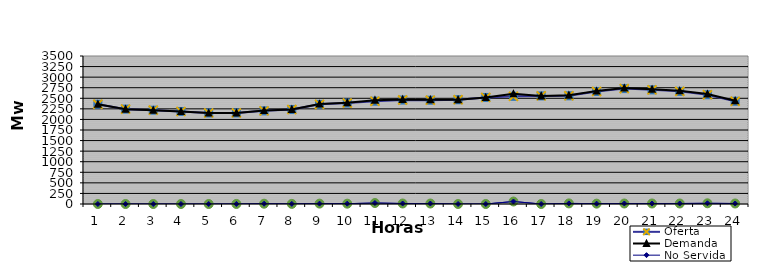
| Category | Oferta | No Servida | Demanda |
|---|---|---|---|
| 1.0 | 2359.7 | 0 | 2359.7 |
| 2.0 | 2243.56 | 0 | 2243.56 |
| 3.0 | 2218.55 | 0 | 2218.55 |
| 4.0 | 2187.33 | 0 | 2187.33 |
| 5.0 | 2151.81 | 0 | 2151.81 |
| 6.0 | 2153.67 | 1.23 | 2154.9 |
| 7.0 | 2202.43 | 6.9 | 2209.33 |
| 8.0 | 2234 | 2.69 | 2236.69 |
| 9.0 | 2356.62 | 9.014 | 2365.634 |
| 10.0 | 2387.81 | 7.548 | 2395.358 |
| 11.0 | 2430.91 | 23.62 | 2454.53 |
| 12.0 | 2459.01 | 11.83 | 2470.84 |
| 13.0 | 2454.91 | 11.35 | 2466.26 |
| 14.0 | 2466.04 | 0 | 2466.04 |
| 15.0 | 2519.87 | 0 | 2519.87 |
| 16.0 | 2546.17 | 58.767 | 2604.937 |
| 17.0 | 2556.69 | 0 | 2556.69 |
| 18.0 | 2559.29 | 14.14 | 2573.43 |
| 19.0 | 2661.31 | 8.3 | 2669.61 |
| 20.0 | 2729.24 | 11.96 | 2741.2 |
| 21.0 | 2699.5 | 11.92 | 2711.42 |
| 22.0 | 2663.41 | 11.92 | 2675.33 |
| 23.0 | 2583.53 | 16.7 | 2600.23 |
| 24.0 | 2429.21 | 11.92 | 2441.13 |